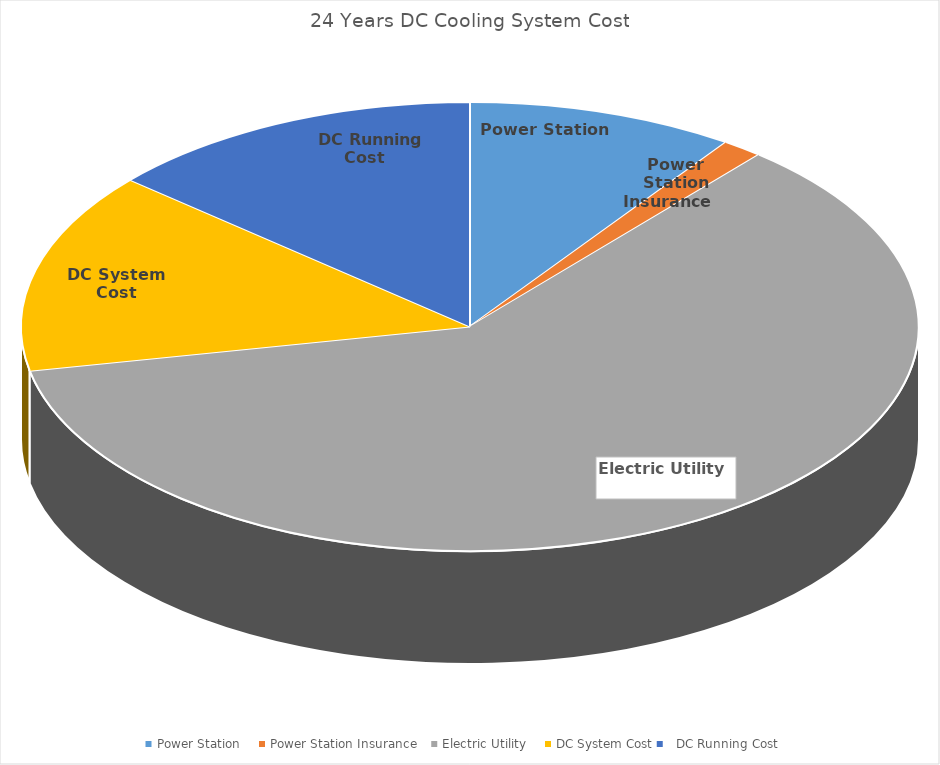
| Category | Series 0 |
|---|---|
| Power Station     | 140080229.313 |
| Power Station Insurance    | 21227591.497 |
| Electric Utility     | 880171316.269 |
| DC System Cost | 210014960 |
|   DC Running Cost | 198087311.801 |